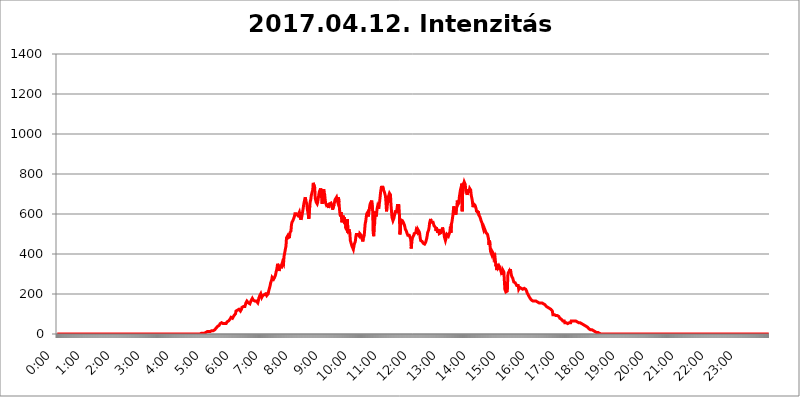
| Category | 2017.04.12. Intenzitás [W/m^2] |
|---|---|
| 0.0 | 0 |
| 0.0006944444444444445 | 0 |
| 0.001388888888888889 | 0 |
| 0.0020833333333333333 | 0 |
| 0.002777777777777778 | 0 |
| 0.003472222222222222 | 0 |
| 0.004166666666666667 | 0 |
| 0.004861111111111111 | 0 |
| 0.005555555555555556 | 0 |
| 0.0062499999999999995 | 0 |
| 0.006944444444444444 | 0 |
| 0.007638888888888889 | 0 |
| 0.008333333333333333 | 0 |
| 0.009027777777777779 | 0 |
| 0.009722222222222222 | 0 |
| 0.010416666666666666 | 0 |
| 0.011111111111111112 | 0 |
| 0.011805555555555555 | 0 |
| 0.012499999999999999 | 0 |
| 0.013194444444444444 | 0 |
| 0.013888888888888888 | 0 |
| 0.014583333333333332 | 0 |
| 0.015277777777777777 | 0 |
| 0.015972222222222224 | 0 |
| 0.016666666666666666 | 0 |
| 0.017361111111111112 | 0 |
| 0.018055555555555557 | 0 |
| 0.01875 | 0 |
| 0.019444444444444445 | 0 |
| 0.02013888888888889 | 0 |
| 0.020833333333333332 | 0 |
| 0.02152777777777778 | 0 |
| 0.022222222222222223 | 0 |
| 0.02291666666666667 | 0 |
| 0.02361111111111111 | 0 |
| 0.024305555555555556 | 0 |
| 0.024999999999999998 | 0 |
| 0.025694444444444447 | 0 |
| 0.02638888888888889 | 0 |
| 0.027083333333333334 | 0 |
| 0.027777777777777776 | 0 |
| 0.02847222222222222 | 0 |
| 0.029166666666666664 | 0 |
| 0.029861111111111113 | 0 |
| 0.030555555555555555 | 0 |
| 0.03125 | 0 |
| 0.03194444444444445 | 0 |
| 0.03263888888888889 | 0 |
| 0.03333333333333333 | 0 |
| 0.034027777777777775 | 0 |
| 0.034722222222222224 | 0 |
| 0.035416666666666666 | 0 |
| 0.036111111111111115 | 0 |
| 0.03680555555555556 | 0 |
| 0.0375 | 0 |
| 0.03819444444444444 | 0 |
| 0.03888888888888889 | 0 |
| 0.03958333333333333 | 0 |
| 0.04027777777777778 | 0 |
| 0.04097222222222222 | 0 |
| 0.041666666666666664 | 0 |
| 0.042361111111111106 | 0 |
| 0.04305555555555556 | 0 |
| 0.043750000000000004 | 0 |
| 0.044444444444444446 | 0 |
| 0.04513888888888889 | 0 |
| 0.04583333333333334 | 0 |
| 0.04652777777777778 | 0 |
| 0.04722222222222222 | 0 |
| 0.04791666666666666 | 0 |
| 0.04861111111111111 | 0 |
| 0.049305555555555554 | 0 |
| 0.049999999999999996 | 0 |
| 0.05069444444444445 | 0 |
| 0.051388888888888894 | 0 |
| 0.052083333333333336 | 0 |
| 0.05277777777777778 | 0 |
| 0.05347222222222222 | 0 |
| 0.05416666666666667 | 0 |
| 0.05486111111111111 | 0 |
| 0.05555555555555555 | 0 |
| 0.05625 | 0 |
| 0.05694444444444444 | 0 |
| 0.057638888888888885 | 0 |
| 0.05833333333333333 | 0 |
| 0.05902777777777778 | 0 |
| 0.059722222222222225 | 0 |
| 0.06041666666666667 | 0 |
| 0.061111111111111116 | 0 |
| 0.06180555555555556 | 0 |
| 0.0625 | 0 |
| 0.06319444444444444 | 0 |
| 0.06388888888888888 | 0 |
| 0.06458333333333334 | 0 |
| 0.06527777777777778 | 0 |
| 0.06597222222222222 | 0 |
| 0.06666666666666667 | 0 |
| 0.06736111111111111 | 0 |
| 0.06805555555555555 | 0 |
| 0.06874999999999999 | 0 |
| 0.06944444444444443 | 0 |
| 0.07013888888888889 | 0 |
| 0.07083333333333333 | 0 |
| 0.07152777777777779 | 0 |
| 0.07222222222222223 | 0 |
| 0.07291666666666667 | 0 |
| 0.07361111111111111 | 0 |
| 0.07430555555555556 | 0 |
| 0.075 | 0 |
| 0.07569444444444444 | 0 |
| 0.0763888888888889 | 0 |
| 0.07708333333333334 | 0 |
| 0.07777777777777778 | 0 |
| 0.07847222222222222 | 0 |
| 0.07916666666666666 | 0 |
| 0.0798611111111111 | 0 |
| 0.08055555555555556 | 0 |
| 0.08125 | 0 |
| 0.08194444444444444 | 0 |
| 0.08263888888888889 | 0 |
| 0.08333333333333333 | 0 |
| 0.08402777777777777 | 0 |
| 0.08472222222222221 | 0 |
| 0.08541666666666665 | 0 |
| 0.08611111111111112 | 0 |
| 0.08680555555555557 | 0 |
| 0.08750000000000001 | 0 |
| 0.08819444444444445 | 0 |
| 0.08888888888888889 | 0 |
| 0.08958333333333333 | 0 |
| 0.09027777777777778 | 0 |
| 0.09097222222222222 | 0 |
| 0.09166666666666667 | 0 |
| 0.09236111111111112 | 0 |
| 0.09305555555555556 | 0 |
| 0.09375 | 0 |
| 0.09444444444444444 | 0 |
| 0.09513888888888888 | 0 |
| 0.09583333333333333 | 0 |
| 0.09652777777777777 | 0 |
| 0.09722222222222222 | 0 |
| 0.09791666666666667 | 0 |
| 0.09861111111111111 | 0 |
| 0.09930555555555555 | 0 |
| 0.09999999999999999 | 0 |
| 0.10069444444444443 | 0 |
| 0.1013888888888889 | 0 |
| 0.10208333333333335 | 0 |
| 0.10277777777777779 | 0 |
| 0.10347222222222223 | 0 |
| 0.10416666666666667 | 0 |
| 0.10486111111111111 | 0 |
| 0.10555555555555556 | 0 |
| 0.10625 | 0 |
| 0.10694444444444444 | 0 |
| 0.1076388888888889 | 0 |
| 0.10833333333333334 | 0 |
| 0.10902777777777778 | 0 |
| 0.10972222222222222 | 0 |
| 0.1111111111111111 | 0 |
| 0.11180555555555556 | 0 |
| 0.11180555555555556 | 0 |
| 0.1125 | 0 |
| 0.11319444444444444 | 0 |
| 0.11388888888888889 | 0 |
| 0.11458333333333333 | 0 |
| 0.11527777777777777 | 0 |
| 0.11597222222222221 | 0 |
| 0.11666666666666665 | 0 |
| 0.1173611111111111 | 0 |
| 0.11805555555555557 | 0 |
| 0.11944444444444445 | 0 |
| 0.12013888888888889 | 0 |
| 0.12083333333333333 | 0 |
| 0.12152777777777778 | 0 |
| 0.12222222222222223 | 0 |
| 0.12291666666666667 | 0 |
| 0.12291666666666667 | 0 |
| 0.12361111111111112 | 0 |
| 0.12430555555555556 | 0 |
| 0.125 | 0 |
| 0.12569444444444444 | 0 |
| 0.12638888888888888 | 0 |
| 0.12708333333333333 | 0 |
| 0.16875 | 0 |
| 0.12847222222222224 | 0 |
| 0.12916666666666668 | 0 |
| 0.12986111111111112 | 0 |
| 0.13055555555555556 | 0 |
| 0.13125 | 0 |
| 0.13194444444444445 | 0 |
| 0.1326388888888889 | 0 |
| 0.13333333333333333 | 0 |
| 0.13402777777777777 | 0 |
| 0.13402777777777777 | 0 |
| 0.13472222222222222 | 0 |
| 0.13541666666666666 | 0 |
| 0.1361111111111111 | 0 |
| 0.13749999999999998 | 0 |
| 0.13819444444444443 | 0 |
| 0.1388888888888889 | 0 |
| 0.13958333333333334 | 0 |
| 0.14027777777777778 | 0 |
| 0.14097222222222222 | 0 |
| 0.14166666666666666 | 0 |
| 0.1423611111111111 | 0 |
| 0.14305555555555557 | 0 |
| 0.14375000000000002 | 0 |
| 0.14444444444444446 | 0 |
| 0.1451388888888889 | 0 |
| 0.1451388888888889 | 0 |
| 0.14652777777777778 | 0 |
| 0.14722222222222223 | 0 |
| 0.14791666666666667 | 0 |
| 0.1486111111111111 | 0 |
| 0.14930555555555555 | 0 |
| 0.15 | 0 |
| 0.15069444444444444 | 0 |
| 0.15138888888888888 | 0 |
| 0.15208333333333332 | 0 |
| 0.15277777777777776 | 0 |
| 0.15347222222222223 | 0 |
| 0.15416666666666667 | 0 |
| 0.15486111111111112 | 0 |
| 0.15555555555555556 | 0 |
| 0.15625 | 0 |
| 0.15694444444444444 | 0 |
| 0.15763888888888888 | 0 |
| 0.15833333333333333 | 0 |
| 0.15902777777777777 | 0 |
| 0.15972222222222224 | 0 |
| 0.16041666666666668 | 0 |
| 0.16111111111111112 | 0 |
| 0.16180555555555556 | 0 |
| 0.1625 | 0 |
| 0.16319444444444445 | 0 |
| 0.1638888888888889 | 0 |
| 0.16458333333333333 | 0 |
| 0.16527777777777777 | 0 |
| 0.16597222222222222 | 0 |
| 0.16666666666666666 | 0 |
| 0.1673611111111111 | 0 |
| 0.16805555555555554 | 0 |
| 0.16874999999999998 | 0 |
| 0.16944444444444443 | 0 |
| 0.17013888888888887 | 0 |
| 0.1708333333333333 | 0 |
| 0.17152777777777775 | 0 |
| 0.17222222222222225 | 0 |
| 0.1729166666666667 | 0 |
| 0.17361111111111113 | 0 |
| 0.17430555555555557 | 0 |
| 0.17500000000000002 | 0 |
| 0.17569444444444446 | 0 |
| 0.1763888888888889 | 0 |
| 0.17708333333333334 | 0 |
| 0.17777777777777778 | 0 |
| 0.17847222222222223 | 0 |
| 0.17916666666666667 | 0 |
| 0.1798611111111111 | 0 |
| 0.18055555555555555 | 0 |
| 0.18125 | 0 |
| 0.18194444444444444 | 0 |
| 0.1826388888888889 | 0 |
| 0.18333333333333335 | 0 |
| 0.1840277777777778 | 0 |
| 0.18472222222222223 | 0 |
| 0.18541666666666667 | 0 |
| 0.18611111111111112 | 0 |
| 0.18680555555555556 | 0 |
| 0.1875 | 0 |
| 0.18819444444444444 | 0 |
| 0.18888888888888888 | 0 |
| 0.18958333333333333 | 0 |
| 0.19027777777777777 | 0 |
| 0.1909722222222222 | 0 |
| 0.19166666666666665 | 0 |
| 0.19236111111111112 | 0 |
| 0.19305555555555554 | 0 |
| 0.19375 | 0 |
| 0.19444444444444445 | 0 |
| 0.1951388888888889 | 0 |
| 0.19583333333333333 | 0 |
| 0.19652777777777777 | 0 |
| 0.19722222222222222 | 0 |
| 0.19791666666666666 | 0 |
| 0.1986111111111111 | 0 |
| 0.19930555555555554 | 0 |
| 0.19999999999999998 | 0 |
| 0.20069444444444443 | 0 |
| 0.20138888888888887 | 3.525 |
| 0.2020833333333333 | 3.525 |
| 0.2027777777777778 | 3.525 |
| 0.2034722222222222 | 3.525 |
| 0.2041666666666667 | 3.525 |
| 0.20486111111111113 | 3.525 |
| 0.20555555555555557 | 7.887 |
| 0.20625000000000002 | 3.525 |
| 0.20694444444444446 | 7.887 |
| 0.2076388888888889 | 7.887 |
| 0.20833333333333334 | 7.887 |
| 0.20902777777777778 | 12.257 |
| 0.20972222222222223 | 12.257 |
| 0.21041666666666667 | 12.257 |
| 0.2111111111111111 | 12.257 |
| 0.21180555555555555 | 12.257 |
| 0.2125 | 12.257 |
| 0.21319444444444444 | 12.257 |
| 0.2138888888888889 | 12.257 |
| 0.21458333333333335 | 12.257 |
| 0.2152777777777778 | 12.257 |
| 0.21597222222222223 | 16.636 |
| 0.21666666666666667 | 16.636 |
| 0.21736111111111112 | 16.636 |
| 0.21805555555555556 | 16.636 |
| 0.21875 | 16.636 |
| 0.21944444444444444 | 21.024 |
| 0.22013888888888888 | 21.024 |
| 0.22083333333333333 | 21.024 |
| 0.22152777777777777 | 25.419 |
| 0.2222222222222222 | 25.419 |
| 0.22291666666666665 | 29.823 |
| 0.2236111111111111 | 29.823 |
| 0.22430555555555556 | 34.234 |
| 0.225 | 38.653 |
| 0.22569444444444445 | 38.653 |
| 0.2263888888888889 | 38.653 |
| 0.22708333333333333 | 43.079 |
| 0.22777777777777777 | 47.511 |
| 0.22847222222222222 | 51.951 |
| 0.22916666666666666 | 51.951 |
| 0.2298611111111111 | 51.951 |
| 0.23055555555555554 | 56.398 |
| 0.23124999999999998 | 56.398 |
| 0.23194444444444443 | 51.951 |
| 0.23263888888888887 | 51.951 |
| 0.2333333333333333 | 51.951 |
| 0.2340277777777778 | 51.951 |
| 0.2347222222222222 | 51.951 |
| 0.2354166666666667 | 51.951 |
| 0.23611111111111113 | 51.951 |
| 0.23680555555555557 | 51.951 |
| 0.23750000000000002 | 56.398 |
| 0.23819444444444446 | 60.85 |
| 0.2388888888888889 | 65.31 |
| 0.23958333333333334 | 65.31 |
| 0.24027777777777778 | 65.31 |
| 0.24097222222222223 | 65.31 |
| 0.24166666666666667 | 69.775 |
| 0.2423611111111111 | 74.246 |
| 0.24305555555555555 | 78.722 |
| 0.24375 | 83.205 |
| 0.24444444444444446 | 83.205 |
| 0.24513888888888888 | 78.722 |
| 0.24583333333333335 | 78.722 |
| 0.2465277777777778 | 78.722 |
| 0.24722222222222223 | 83.205 |
| 0.24791666666666667 | 92.184 |
| 0.24861111111111112 | 92.184 |
| 0.24930555555555556 | 96.682 |
| 0.25 | 101.184 |
| 0.25069444444444444 | 114.716 |
| 0.2513888888888889 | 114.716 |
| 0.2520833333333333 | 119.235 |
| 0.25277777777777777 | 119.235 |
| 0.2534722222222222 | 123.758 |
| 0.25416666666666665 | 123.758 |
| 0.2548611111111111 | 123.758 |
| 0.2555555555555556 | 119.235 |
| 0.25625000000000003 | 119.235 |
| 0.2569444444444445 | 114.716 |
| 0.2576388888888889 | 119.235 |
| 0.25833333333333336 | 123.758 |
| 0.2590277777777778 | 132.814 |
| 0.25972222222222224 | 137.347 |
| 0.2604166666666667 | 137.347 |
| 0.2611111111111111 | 137.347 |
| 0.26180555555555557 | 132.814 |
| 0.2625 | 137.347 |
| 0.26319444444444445 | 137.347 |
| 0.2638888888888889 | 146.423 |
| 0.26458333333333334 | 155.509 |
| 0.2652777777777778 | 160.056 |
| 0.2659722222222222 | 164.605 |
| 0.26666666666666666 | 169.156 |
| 0.2673611111111111 | 169.156 |
| 0.26805555555555555 | 155.509 |
| 0.26875 | 155.509 |
| 0.26944444444444443 | 150.964 |
| 0.2701388888888889 | 150.964 |
| 0.2708333333333333 | 155.509 |
| 0.27152777777777776 | 164.605 |
| 0.2722222222222222 | 164.605 |
| 0.27291666666666664 | 169.156 |
| 0.2736111111111111 | 178.264 |
| 0.2743055555555555 | 173.709 |
| 0.27499999999999997 | 169.156 |
| 0.27569444444444446 | 169.156 |
| 0.27638888888888885 | 169.156 |
| 0.27708333333333335 | 164.605 |
| 0.2777777777777778 | 164.605 |
| 0.27847222222222223 | 164.605 |
| 0.2791666666666667 | 164.605 |
| 0.2798611111111111 | 160.056 |
| 0.28055555555555556 | 160.056 |
| 0.28125 | 155.509 |
| 0.28194444444444444 | 164.605 |
| 0.2826388888888889 | 178.264 |
| 0.2833333333333333 | 182.82 |
| 0.28402777777777777 | 191.937 |
| 0.2847222222222222 | 196.497 |
| 0.28541666666666665 | 201.058 |
| 0.28611111111111115 | 191.937 |
| 0.28680555555555554 | 182.82 |
| 0.28750000000000003 | 182.82 |
| 0.2881944444444445 | 191.937 |
| 0.2888888888888889 | 187.378 |
| 0.28958333333333336 | 187.378 |
| 0.2902777777777778 | 196.497 |
| 0.29097222222222224 | 201.058 |
| 0.2916666666666667 | 201.058 |
| 0.2923611111111111 | 201.058 |
| 0.29305555555555557 | 196.497 |
| 0.29375 | 191.937 |
| 0.29444444444444445 | 191.937 |
| 0.2951388888888889 | 191.937 |
| 0.29583333333333334 | 201.058 |
| 0.2965277777777778 | 214.746 |
| 0.2972222222222222 | 223.873 |
| 0.29791666666666666 | 228.436 |
| 0.2986111111111111 | 242.127 |
| 0.29930555555555555 | 255.813 |
| 0.3 | 260.373 |
| 0.30069444444444443 | 269.49 |
| 0.3013888888888889 | 283.156 |
| 0.3020833333333333 | 283.156 |
| 0.30277777777777776 | 283.156 |
| 0.3034722222222222 | 274.047 |
| 0.30416666666666664 | 274.047 |
| 0.3048611111111111 | 283.156 |
| 0.3055555555555555 | 287.709 |
| 0.30624999999999997 | 296.808 |
| 0.3069444444444444 | 310.44 |
| 0.3076388888888889 | 319.517 |
| 0.30833333333333335 | 333.113 |
| 0.3090277777777778 | 351.198 |
| 0.30972222222222223 | 351.198 |
| 0.3104166666666667 | 333.113 |
| 0.3111111111111111 | 314.98 |
| 0.31180555555555556 | 328.584 |
| 0.3125 | 324.052 |
| 0.31319444444444444 | 337.639 |
| 0.3138888888888889 | 346.682 |
| 0.3145833333333333 | 328.584 |
| 0.31527777777777777 | 351.198 |
| 0.3159722222222222 | 360.221 |
| 0.31666666666666665 | 364.728 |
| 0.31736111111111115 | 351.198 |
| 0.31805555555555554 | 387.202 |
| 0.31875000000000003 | 400.638 |
| 0.3194444444444445 | 405.108 |
| 0.3201388888888889 | 405.108 |
| 0.32083333333333336 | 440.702 |
| 0.3215277777777778 | 480.356 |
| 0.32222222222222224 | 484.735 |
| 0.3229166666666667 | 489.108 |
| 0.3236111111111111 | 480.356 |
| 0.32430555555555557 | 484.735 |
| 0.325 | 475.972 |
| 0.32569444444444445 | 484.735 |
| 0.3263888888888889 | 506.542 |
| 0.32708333333333334 | 506.542 |
| 0.3277777777777778 | 515.223 |
| 0.3284722222222222 | 545.416 |
| 0.32916666666666666 | 558.261 |
| 0.3298611111111111 | 558.261 |
| 0.33055555555555555 | 566.793 |
| 0.33125 | 566.793 |
| 0.33194444444444443 | 571.049 |
| 0.3326388888888889 | 588.009 |
| 0.3333333333333333 | 600.661 |
| 0.3340277777777778 | 604.864 |
| 0.3347222222222222 | 604.864 |
| 0.3354166666666667 | 600.661 |
| 0.3361111111111111 | 596.45 |
| 0.3368055555555556 | 596.45 |
| 0.33749999999999997 | 592.233 |
| 0.33819444444444446 | 588.009 |
| 0.33888888888888885 | 592.233 |
| 0.33958333333333335 | 609.062 |
| 0.34027777777777773 | 596.45 |
| 0.34097222222222223 | 583.779 |
| 0.3416666666666666 | 571.049 |
| 0.3423611111111111 | 575.299 |
| 0.3430555555555555 | 588.009 |
| 0.34375 | 588.009 |
| 0.3444444444444445 | 617.436 |
| 0.3451388888888889 | 634.105 |
| 0.3458333333333334 | 650.667 |
| 0.34652777777777777 | 654.791 |
| 0.34722222222222227 | 675.311 |
| 0.34791666666666665 | 683.473 |
| 0.34861111111111115 | 667.123 |
| 0.34930555555555554 | 658.909 |
| 0.35000000000000003 | 650.667 |
| 0.3506944444444444 | 625.784 |
| 0.3513888888888889 | 625.784 |
| 0.3520833333333333 | 596.45 |
| 0.3527777777777778 | 575.299 |
| 0.3534722222222222 | 575.299 |
| 0.3541666666666667 | 642.4 |
| 0.3548611111111111 | 663.019 |
| 0.35555555555555557 | 671.22 |
| 0.35625 | 691.608 |
| 0.35694444444444445 | 691.608 |
| 0.3576388888888889 | 711.832 |
| 0.35833333333333334 | 719.877 |
| 0.3590277777777778 | 755.766 |
| 0.3597222222222222 | 755.766 |
| 0.36041666666666666 | 751.803 |
| 0.3611111111111111 | 731.896 |
| 0.36180555555555555 | 679.395 |
| 0.3625 | 675.311 |
| 0.36319444444444443 | 658.909 |
| 0.3638888888888889 | 658.909 |
| 0.3645833333333333 | 650.667 |
| 0.3652777777777778 | 658.909 |
| 0.3659722222222222 | 675.311 |
| 0.3666666666666667 | 691.608 |
| 0.3673611111111111 | 707.8 |
| 0.3680555555555556 | 715.858 |
| 0.36874999999999997 | 711.832 |
| 0.36944444444444446 | 727.896 |
| 0.37013888888888885 | 703.762 |
| 0.37083333333333335 | 679.395 |
| 0.37152777777777773 | 650.667 |
| 0.37222222222222223 | 683.473 |
| 0.3729166666666666 | 707.8 |
| 0.3736111111111111 | 723.889 |
| 0.3743055555555555 | 707.8 |
| 0.375 | 699.717 |
| 0.3756944444444445 | 675.311 |
| 0.3763888888888889 | 654.791 |
| 0.3770833333333334 | 650.667 |
| 0.37777777777777777 | 642.4 |
| 0.37847222222222227 | 642.4 |
| 0.37916666666666665 | 646.537 |
| 0.37986111111111115 | 646.537 |
| 0.38055555555555554 | 629.948 |
| 0.38125000000000003 | 642.4 |
| 0.3819444444444444 | 650.667 |
| 0.3826388888888889 | 646.537 |
| 0.3833333333333333 | 646.537 |
| 0.3840277777777778 | 654.791 |
| 0.3847222222222222 | 650.667 |
| 0.3854166666666667 | 642.4 |
| 0.3861111111111111 | 621.613 |
| 0.38680555555555557 | 617.436 |
| 0.3875 | 625.784 |
| 0.38819444444444445 | 646.537 |
| 0.3888888888888889 | 658.909 |
| 0.38958333333333334 | 671.22 |
| 0.3902777777777778 | 675.311 |
| 0.3909722222222222 | 671.22 |
| 0.39166666666666666 | 683.473 |
| 0.3923611111111111 | 671.22 |
| 0.39305555555555555 | 663.019 |
| 0.39375 | 667.123 |
| 0.39444444444444443 | 683.473 |
| 0.3951388888888889 | 658.909 |
| 0.3958333333333333 | 625.784 |
| 0.3965277777777778 | 600.661 |
| 0.3972222222222222 | 588.009 |
| 0.3979166666666667 | 609.062 |
| 0.3986111111111111 | 583.779 |
| 0.3993055555555556 | 558.261 |
| 0.39999999999999997 | 575.299 |
| 0.40069444444444446 | 592.233 |
| 0.40138888888888885 | 592.233 |
| 0.40208333333333335 | 575.299 |
| 0.40277777777777773 | 583.779 |
| 0.40347222222222223 | 549.704 |
| 0.4041666666666666 | 558.261 |
| 0.4048611111111111 | 528.2 |
| 0.4055555555555555 | 532.513 |
| 0.40625 | 519.555 |
| 0.4069444444444445 | 575.299 |
| 0.4076388888888889 | 506.542 |
| 0.4083333333333334 | 510.885 |
| 0.40902777777777777 | 523.88 |
| 0.40972222222222227 | 519.555 |
| 0.41041666666666665 | 502.192 |
| 0.41111111111111115 | 467.187 |
| 0.41180555555555554 | 471.582 |
| 0.41250000000000003 | 449.551 |
| 0.4131944444444444 | 440.702 |
| 0.4138888888888889 | 440.702 |
| 0.4145833333333333 | 436.27 |
| 0.4152777777777778 | 422.943 |
| 0.4159722222222222 | 422.943 |
| 0.4166666666666667 | 449.551 |
| 0.4173611111111111 | 453.968 |
| 0.41805555555555557 | 462.786 |
| 0.41875 | 484.735 |
| 0.41944444444444445 | 497.836 |
| 0.4201388888888889 | 502.192 |
| 0.42083333333333334 | 493.475 |
| 0.4215277777777778 | 497.836 |
| 0.4222222222222222 | 502.192 |
| 0.42291666666666666 | 493.475 |
| 0.4236111111111111 | 489.108 |
| 0.42430555555555555 | 502.192 |
| 0.425 | 506.542 |
| 0.42569444444444443 | 497.836 |
| 0.4263888888888889 | 493.475 |
| 0.4270833333333333 | 484.735 |
| 0.4277777777777778 | 480.356 |
| 0.4284722222222222 | 462.786 |
| 0.4291666666666667 | 475.972 |
| 0.4298611111111111 | 475.972 |
| 0.4305555555555556 | 493.475 |
| 0.43124999999999997 | 523.88 |
| 0.43194444444444446 | 553.986 |
| 0.43263888888888885 | 562.53 |
| 0.43333333333333335 | 583.779 |
| 0.43402777777777773 | 600.661 |
| 0.43472222222222223 | 604.864 |
| 0.4354166666666666 | 609.062 |
| 0.4361111111111111 | 588.009 |
| 0.4368055555555555 | 600.661 |
| 0.4375 | 617.436 |
| 0.4381944444444445 | 638.256 |
| 0.4388888888888889 | 650.667 |
| 0.4395833333333334 | 650.667 |
| 0.44027777777777777 | 654.791 |
| 0.44097222222222227 | 667.123 |
| 0.44166666666666665 | 663.019 |
| 0.44236111111111115 | 617.436 |
| 0.44305555555555554 | 510.885 |
| 0.44375000000000003 | 489.108 |
| 0.4444444444444444 | 532.513 |
| 0.4451388888888889 | 549.704 |
| 0.4458333333333333 | 596.45 |
| 0.4465277777777778 | 613.252 |
| 0.4472222222222222 | 588.009 |
| 0.4479166666666667 | 604.864 |
| 0.4486111111111111 | 625.784 |
| 0.44930555555555557 | 638.256 |
| 0.45 | 638.256 |
| 0.45069444444444445 | 625.784 |
| 0.4513888888888889 | 646.537 |
| 0.45208333333333334 | 658.909 |
| 0.4527777777777778 | 683.473 |
| 0.4534722222222222 | 707.8 |
| 0.45416666666666666 | 723.889 |
| 0.4548611111111111 | 739.877 |
| 0.45555555555555555 | 727.896 |
| 0.45625 | 739.877 |
| 0.45694444444444443 | 739.877 |
| 0.4576388888888889 | 719.877 |
| 0.4583333333333333 | 723.889 |
| 0.4590277777777778 | 707.8 |
| 0.4597222222222222 | 703.762 |
| 0.4604166666666667 | 687.544 |
| 0.4611111111111111 | 654.791 |
| 0.4618055555555556 | 613.252 |
| 0.46249999999999997 | 634.105 |
| 0.46319444444444446 | 650.667 |
| 0.46388888888888885 | 675.311 |
| 0.46458333333333335 | 687.544 |
| 0.46527777777777773 | 695.666 |
| 0.46597222222222223 | 703.762 |
| 0.4666666666666666 | 703.762 |
| 0.4673611111111111 | 695.666 |
| 0.4680555555555555 | 646.537 |
| 0.46875 | 617.436 |
| 0.4694444444444445 | 583.779 |
| 0.4701388888888889 | 575.299 |
| 0.4708333333333334 | 566.793 |
| 0.47152777777777777 | 562.53 |
| 0.47222222222222227 | 579.542 |
| 0.47291666666666665 | 592.233 |
| 0.47361111111111115 | 592.233 |
| 0.47430555555555554 | 617.436 |
| 0.47500000000000003 | 604.864 |
| 0.4756944444444444 | 613.252 |
| 0.4763888888888889 | 621.613 |
| 0.4770833333333333 | 642.4 |
| 0.4777777777777778 | 638.256 |
| 0.4784722222222222 | 646.537 |
| 0.4791666666666667 | 642.4 |
| 0.4798611111111111 | 600.661 |
| 0.48055555555555557 | 497.836 |
| 0.48125 | 515.223 |
| 0.48194444444444445 | 571.049 |
| 0.4826388888888889 | 575.299 |
| 0.48333333333333334 | 566.793 |
| 0.4840277777777778 | 566.793 |
| 0.4847222222222222 | 562.53 |
| 0.48541666666666666 | 558.261 |
| 0.4861111111111111 | 558.261 |
| 0.48680555555555555 | 545.416 |
| 0.4875 | 536.82 |
| 0.48819444444444443 | 523.88 |
| 0.4888888888888889 | 519.555 |
| 0.4895833333333333 | 515.223 |
| 0.4902777777777778 | 506.542 |
| 0.4909722222222222 | 502.192 |
| 0.4916666666666667 | 493.475 |
| 0.4923611111111111 | 489.108 |
| 0.4930555555555556 | 493.475 |
| 0.49374999999999997 | 493.475 |
| 0.49444444444444446 | 489.108 |
| 0.49513888888888885 | 480.356 |
| 0.49583333333333335 | 471.582 |
| 0.49652777777777773 | 427.39 |
| 0.49722222222222223 | 462.786 |
| 0.4979166666666666 | 475.972 |
| 0.4986111111111111 | 484.735 |
| 0.4993055555555555 | 484.735 |
| 0.5 | 493.475 |
| 0.5006944444444444 | 502.192 |
| 0.5013888888888889 | 506.542 |
| 0.5020833333333333 | 502.192 |
| 0.5027777777777778 | 506.542 |
| 0.5034722222222222 | 519.555 |
| 0.5041666666666667 | 515.223 |
| 0.5048611111111111 | 510.885 |
| 0.5055555555555555 | 523.88 |
| 0.50625 | 523.88 |
| 0.5069444444444444 | 523.88 |
| 0.5076388888888889 | 510.885 |
| 0.5083333333333333 | 502.192 |
| 0.5090277777777777 | 480.356 |
| 0.5097222222222222 | 467.187 |
| 0.5104166666666666 | 462.786 |
| 0.5111111111111112 | 471.582 |
| 0.5118055555555555 | 462.786 |
| 0.5125000000000001 | 462.786 |
| 0.5131944444444444 | 453.968 |
| 0.513888888888889 | 453.968 |
| 0.5145833333333333 | 453.968 |
| 0.5152777777777778 | 449.551 |
| 0.5159722222222222 | 453.968 |
| 0.5166666666666667 | 458.38 |
| 0.517361111111111 | 462.786 |
| 0.5180555555555556 | 475.972 |
| 0.5187499999999999 | 489.108 |
| 0.5194444444444445 | 506.542 |
| 0.5201388888888888 | 510.885 |
| 0.5208333333333334 | 519.555 |
| 0.5215277777777778 | 532.513 |
| 0.5222222222222223 | 553.986 |
| 0.5229166666666667 | 558.261 |
| 0.5236111111111111 | 575.299 |
| 0.5243055555555556 | 566.793 |
| 0.525 | 558.261 |
| 0.5256944444444445 | 558.261 |
| 0.5263888888888889 | 558.261 |
| 0.5270833333333333 | 558.261 |
| 0.5277777777777778 | 553.986 |
| 0.5284722222222222 | 541.121 |
| 0.5291666666666667 | 541.121 |
| 0.5298611111111111 | 541.121 |
| 0.5305555555555556 | 532.513 |
| 0.53125 | 515.223 |
| 0.5319444444444444 | 532.513 |
| 0.5326388888888889 | 519.555 |
| 0.5333333333333333 | 506.542 |
| 0.5340277777777778 | 523.88 |
| 0.5347222222222222 | 515.223 |
| 0.5354166666666667 | 523.88 |
| 0.5361111111111111 | 502.192 |
| 0.5368055555555555 | 502.192 |
| 0.5375 | 502.192 |
| 0.5381944444444444 | 506.542 |
| 0.5388888888888889 | 506.542 |
| 0.5395833333333333 | 515.223 |
| 0.5402777777777777 | 532.513 |
| 0.5409722222222222 | 523.88 |
| 0.5416666666666666 | 528.2 |
| 0.5423611111111112 | 502.192 |
| 0.5430555555555555 | 484.735 |
| 0.5437500000000001 | 475.972 |
| 0.5444444444444444 | 467.187 |
| 0.545138888888889 | 475.972 |
| 0.5458333333333333 | 489.108 |
| 0.5465277777777778 | 497.836 |
| 0.5472222222222222 | 502.192 |
| 0.5479166666666667 | 502.192 |
| 0.548611111111111 | 489.108 |
| 0.5493055555555556 | 484.735 |
| 0.5499999999999999 | 489.108 |
| 0.5506944444444445 | 510.885 |
| 0.5513888888888888 | 536.82 |
| 0.5520833333333334 | 506.542 |
| 0.5527777777777778 | 549.704 |
| 0.5534722222222223 | 558.261 |
| 0.5541666666666667 | 575.299 |
| 0.5548611111111111 | 592.233 |
| 0.5555555555555556 | 617.436 |
| 0.55625 | 638.256 |
| 0.5569444444444445 | 621.613 |
| 0.5576388888888889 | 621.613 |
| 0.5583333333333333 | 617.436 |
| 0.5590277777777778 | 596.45 |
| 0.5597222222222222 | 625.784 |
| 0.5604166666666667 | 634.105 |
| 0.5611111111111111 | 667.123 |
| 0.5618055555555556 | 646.537 |
| 0.5625 | 646.537 |
| 0.5631944444444444 | 654.791 |
| 0.5638888888888889 | 683.473 |
| 0.5645833333333333 | 687.544 |
| 0.5652777777777778 | 715.858 |
| 0.5659722222222222 | 727.896 |
| 0.5666666666666667 | 735.89 |
| 0.5673611111111111 | 751.803 |
| 0.5680555555555555 | 613.252 |
| 0.56875 | 735.89 |
| 0.5694444444444444 | 755.766 |
| 0.5701388888888889 | 747.834 |
| 0.5708333333333333 | 759.723 |
| 0.5715277777777777 | 755.766 |
| 0.5722222222222222 | 747.834 |
| 0.5729166666666666 | 719.877 |
| 0.5736111111111112 | 719.877 |
| 0.5743055555555555 | 715.858 |
| 0.5750000000000001 | 695.666 |
| 0.5756944444444444 | 707.8 |
| 0.576388888888889 | 723.889 |
| 0.5770833333333333 | 707.8 |
| 0.5777777777777778 | 715.858 |
| 0.5784722222222222 | 727.896 |
| 0.5791666666666667 | 727.896 |
| 0.579861111111111 | 719.877 |
| 0.5805555555555556 | 695.666 |
| 0.5812499999999999 | 691.608 |
| 0.5819444444444445 | 671.22 |
| 0.5826388888888888 | 650.667 |
| 0.5833333333333334 | 634.105 |
| 0.5840277777777778 | 650.667 |
| 0.5847222222222223 | 646.537 |
| 0.5854166666666667 | 646.537 |
| 0.5861111111111111 | 642.4 |
| 0.5868055555555556 | 638.256 |
| 0.5875 | 625.784 |
| 0.5881944444444445 | 609.062 |
| 0.5888888888888889 | 617.436 |
| 0.5895833333333333 | 604.864 |
| 0.5902777777777778 | 613.252 |
| 0.5909722222222222 | 613.252 |
| 0.5916666666666667 | 592.233 |
| 0.5923611111111111 | 588.009 |
| 0.5930555555555556 | 583.779 |
| 0.59375 | 579.542 |
| 0.5944444444444444 | 566.793 |
| 0.5951388888888889 | 562.53 |
| 0.5958333333333333 | 553.986 |
| 0.5965277777777778 | 558.261 |
| 0.5972222222222222 | 532.513 |
| 0.5979166666666667 | 523.88 |
| 0.5986111111111111 | 532.513 |
| 0.5993055555555555 | 532.513 |
| 0.6 | 519.555 |
| 0.6006944444444444 | 523.88 |
| 0.6013888888888889 | 506.542 |
| 0.6020833333333333 | 506.542 |
| 0.6027777777777777 | 502.192 |
| 0.6034722222222222 | 497.836 |
| 0.6041666666666666 | 493.475 |
| 0.6048611111111112 | 475.972 |
| 0.6055555555555555 | 445.129 |
| 0.6062500000000001 | 467.187 |
| 0.6069444444444444 | 445.129 |
| 0.607638888888889 | 414.035 |
| 0.6083333333333333 | 414.035 |
| 0.6090277777777778 | 400.638 |
| 0.6097222222222222 | 414.035 |
| 0.6104166666666667 | 414.035 |
| 0.611111111111111 | 414.035 |
| 0.6118055555555556 | 400.638 |
| 0.6124999999999999 | 378.224 |
| 0.6131944444444445 | 378.224 |
| 0.6138888888888888 | 387.202 |
| 0.6145833333333334 | 382.715 |
| 0.6152777777777778 | 337.639 |
| 0.6159722222222223 | 351.198 |
| 0.6166666666666667 | 319.517 |
| 0.6173611111111111 | 346.682 |
| 0.6180555555555556 | 333.113 |
| 0.61875 | 328.584 |
| 0.6194444444444445 | 342.162 |
| 0.6201388888888889 | 346.682 |
| 0.6208333333333333 | 333.113 |
| 0.6215277777777778 | 324.052 |
| 0.6222222222222222 | 314.98 |
| 0.6229166666666667 | 324.052 |
| 0.6236111111111111 | 324.052 |
| 0.6243055555555556 | 296.808 |
| 0.625 | 319.517 |
| 0.6256944444444444 | 319.517 |
| 0.6263888888888889 | 310.44 |
| 0.6270833333333333 | 305.898 |
| 0.6277777777777778 | 223.873 |
| 0.6284722222222222 | 228.436 |
| 0.6291666666666667 | 210.182 |
| 0.6298611111111111 | 214.746 |
| 0.6305555555555555 | 205.62 |
| 0.63125 | 214.746 |
| 0.6319444444444444 | 292.259 |
| 0.6326388888888889 | 305.898 |
| 0.6333333333333333 | 310.44 |
| 0.6340277777777777 | 314.98 |
| 0.6347222222222222 | 305.898 |
| 0.6354166666666666 | 324.052 |
| 0.6361111111111112 | 310.44 |
| 0.6368055555555555 | 296.808 |
| 0.6375000000000001 | 287.709 |
| 0.6381944444444444 | 283.156 |
| 0.638888888888889 | 278.603 |
| 0.6395833333333333 | 269.49 |
| 0.6402777777777778 | 260.373 |
| 0.6409722222222222 | 260.373 |
| 0.6416666666666667 | 260.373 |
| 0.642361111111111 | 255.813 |
| 0.6430555555555556 | 255.813 |
| 0.6437499999999999 | 251.251 |
| 0.6444444444444445 | 242.127 |
| 0.6451388888888888 | 242.127 |
| 0.6458333333333334 | 242.127 |
| 0.6465277777777778 | 242.127 |
| 0.6472222222222223 | 223.873 |
| 0.6479166666666667 | 228.436 |
| 0.6486111111111111 | 233 |
| 0.6493055555555556 | 233 |
| 0.65 | 233 |
| 0.6506944444444445 | 228.436 |
| 0.6513888888888889 | 223.873 |
| 0.6520833333333333 | 223.873 |
| 0.6527777777777778 | 223.873 |
| 0.6534722222222222 | 228.436 |
| 0.6541666666666667 | 228.436 |
| 0.6548611111111111 | 228.436 |
| 0.6555555555555556 | 223.873 |
| 0.65625 | 223.873 |
| 0.6569444444444444 | 223.873 |
| 0.6576388888888889 | 219.309 |
| 0.6583333333333333 | 214.746 |
| 0.6590277777777778 | 205.62 |
| 0.6597222222222222 | 201.058 |
| 0.6604166666666667 | 196.497 |
| 0.6611111111111111 | 191.937 |
| 0.6618055555555555 | 187.378 |
| 0.6625 | 182.82 |
| 0.6631944444444444 | 178.264 |
| 0.6638888888888889 | 173.709 |
| 0.6645833333333333 | 173.709 |
| 0.6652777777777777 | 169.156 |
| 0.6659722222222222 | 169.156 |
| 0.6666666666666666 | 164.605 |
| 0.6673611111111111 | 164.605 |
| 0.6680555555555556 | 164.605 |
| 0.6687500000000001 | 164.605 |
| 0.6694444444444444 | 164.605 |
| 0.6701388888888888 | 169.156 |
| 0.6708333333333334 | 169.156 |
| 0.6715277777777778 | 164.605 |
| 0.6722222222222222 | 164.605 |
| 0.6729166666666666 | 160.056 |
| 0.6736111111111112 | 160.056 |
| 0.6743055555555556 | 155.509 |
| 0.6749999999999999 | 155.509 |
| 0.6756944444444444 | 155.509 |
| 0.6763888888888889 | 155.509 |
| 0.6770833333333334 | 155.509 |
| 0.6777777777777777 | 155.509 |
| 0.6784722222222223 | 155.509 |
| 0.6791666666666667 | 155.509 |
| 0.6798611111111111 | 155.509 |
| 0.6805555555555555 | 155.509 |
| 0.68125 | 150.964 |
| 0.6819444444444445 | 150.964 |
| 0.6826388888888889 | 146.423 |
| 0.6833333333333332 | 146.423 |
| 0.6840277777777778 | 146.423 |
| 0.6847222222222222 | 141.884 |
| 0.6854166666666667 | 141.884 |
| 0.686111111111111 | 137.347 |
| 0.6868055555555556 | 137.347 |
| 0.6875 | 132.814 |
| 0.6881944444444444 | 132.814 |
| 0.688888888888889 | 132.814 |
| 0.6895833333333333 | 128.284 |
| 0.6902777777777778 | 128.284 |
| 0.6909722222222222 | 128.284 |
| 0.6916666666666668 | 123.758 |
| 0.6923611111111111 | 123.758 |
| 0.6930555555555555 | 119.235 |
| 0.69375 | 119.235 |
| 0.6944444444444445 | 114.716 |
| 0.6951388888888889 | 96.682 |
| 0.6958333333333333 | 101.184 |
| 0.6965277777777777 | 96.682 |
| 0.6972222222222223 | 96.682 |
| 0.6979166666666666 | 101.184 |
| 0.6986111111111111 | 96.682 |
| 0.6993055555555556 | 92.184 |
| 0.7000000000000001 | 87.692 |
| 0.7006944444444444 | 92.184 |
| 0.7013888888888888 | 92.184 |
| 0.7020833333333334 | 92.184 |
| 0.7027777777777778 | 92.184 |
| 0.7034722222222222 | 87.692 |
| 0.7041666666666666 | 83.205 |
| 0.7048611111111112 | 78.722 |
| 0.7055555555555556 | 74.246 |
| 0.7062499999999999 | 74.246 |
| 0.7069444444444444 | 74.246 |
| 0.7076388888888889 | 69.775 |
| 0.7083333333333334 | 69.775 |
| 0.7090277777777777 | 65.31 |
| 0.7097222222222223 | 65.31 |
| 0.7104166666666667 | 65.31 |
| 0.7111111111111111 | 65.31 |
| 0.7118055555555555 | 56.398 |
| 0.7125 | 56.398 |
| 0.7131944444444445 | 60.85 |
| 0.7138888888888889 | 56.398 |
| 0.7145833333333332 | 56.398 |
| 0.7152777777777778 | 56.398 |
| 0.7159722222222222 | 51.951 |
| 0.7166666666666667 | 56.398 |
| 0.717361111111111 | 51.951 |
| 0.7180555555555556 | 56.398 |
| 0.71875 | 60.85 |
| 0.7194444444444444 | 60.85 |
| 0.720138888888889 | 56.398 |
| 0.7208333333333333 | 65.31 |
| 0.7215277777777778 | 65.31 |
| 0.7222222222222222 | 60.85 |
| 0.7229166666666668 | 65.31 |
| 0.7236111111111111 | 65.31 |
| 0.7243055555555555 | 65.31 |
| 0.725 | 65.31 |
| 0.7256944444444445 | 69.775 |
| 0.7263888888888889 | 69.775 |
| 0.7270833333333333 | 65.31 |
| 0.7277777777777777 | 65.31 |
| 0.7284722222222223 | 60.85 |
| 0.7291666666666666 | 60.85 |
| 0.7298611111111111 | 60.85 |
| 0.7305555555555556 | 60.85 |
| 0.7312500000000001 | 56.398 |
| 0.7319444444444444 | 56.398 |
| 0.7326388888888888 | 56.398 |
| 0.7333333333333334 | 56.398 |
| 0.7340277777777778 | 56.398 |
| 0.7347222222222222 | 51.951 |
| 0.7354166666666666 | 51.951 |
| 0.7361111111111112 | 51.951 |
| 0.7368055555555556 | 47.511 |
| 0.7374999999999999 | 47.511 |
| 0.7381944444444444 | 47.511 |
| 0.7388888888888889 | 47.511 |
| 0.7395833333333334 | 43.079 |
| 0.7402777777777777 | 43.079 |
| 0.7409722222222223 | 43.079 |
| 0.7416666666666667 | 38.653 |
| 0.7423611111111111 | 38.653 |
| 0.7430555555555555 | 34.234 |
| 0.74375 | 34.234 |
| 0.7444444444444445 | 29.823 |
| 0.7451388888888889 | 29.823 |
| 0.7458333333333332 | 25.419 |
| 0.7465277777777778 | 25.419 |
| 0.7472222222222222 | 21.024 |
| 0.7479166666666667 | 21.024 |
| 0.748611111111111 | 21.024 |
| 0.7493055555555556 | 21.024 |
| 0.75 | 21.024 |
| 0.7506944444444444 | 16.636 |
| 0.751388888888889 | 16.636 |
| 0.7520833333333333 | 16.636 |
| 0.7527777777777778 | 12.257 |
| 0.7534722222222222 | 12.257 |
| 0.7541666666666668 | 12.257 |
| 0.7548611111111111 | 12.257 |
| 0.7555555555555555 | 12.257 |
| 0.75625 | 7.887 |
| 0.7569444444444445 | 7.887 |
| 0.7576388888888889 | 7.887 |
| 0.7583333333333333 | 7.887 |
| 0.7590277777777777 | 7.887 |
| 0.7597222222222223 | 3.525 |
| 0.7604166666666666 | 3.525 |
| 0.7611111111111111 | 3.525 |
| 0.7618055555555556 | 0 |
| 0.7625000000000001 | 0 |
| 0.7631944444444444 | 0 |
| 0.7638888888888888 | 0 |
| 0.7645833333333334 | 0 |
| 0.7652777777777778 | 0 |
| 0.7659722222222222 | 0 |
| 0.7666666666666666 | 0 |
| 0.7673611111111112 | 0 |
| 0.7680555555555556 | 0 |
| 0.7687499999999999 | 0 |
| 0.7694444444444444 | 0 |
| 0.7701388888888889 | 0 |
| 0.7708333333333334 | 0 |
| 0.7715277777777777 | 0 |
| 0.7722222222222223 | 0 |
| 0.7729166666666667 | 0 |
| 0.7736111111111111 | 0 |
| 0.7743055555555555 | 0 |
| 0.775 | 0 |
| 0.7756944444444445 | 0 |
| 0.7763888888888889 | 0 |
| 0.7770833333333332 | 0 |
| 0.7777777777777778 | 0 |
| 0.7784722222222222 | 0 |
| 0.7791666666666667 | 0 |
| 0.779861111111111 | 0 |
| 0.7805555555555556 | 0 |
| 0.78125 | 0 |
| 0.7819444444444444 | 0 |
| 0.782638888888889 | 0 |
| 0.7833333333333333 | 0 |
| 0.7840277777777778 | 0 |
| 0.7847222222222222 | 0 |
| 0.7854166666666668 | 0 |
| 0.7861111111111111 | 0 |
| 0.7868055555555555 | 0 |
| 0.7875 | 0 |
| 0.7881944444444445 | 0 |
| 0.7888888888888889 | 0 |
| 0.7895833333333333 | 0 |
| 0.7902777777777777 | 0 |
| 0.7909722222222223 | 0 |
| 0.7916666666666666 | 0 |
| 0.7923611111111111 | 0 |
| 0.7930555555555556 | 0 |
| 0.7937500000000001 | 0 |
| 0.7944444444444444 | 0 |
| 0.7951388888888888 | 0 |
| 0.7958333333333334 | 0 |
| 0.7965277777777778 | 0 |
| 0.7972222222222222 | 0 |
| 0.7979166666666666 | 0 |
| 0.7986111111111112 | 0 |
| 0.7993055555555556 | 0 |
| 0.7999999999999999 | 0 |
| 0.8006944444444444 | 0 |
| 0.8013888888888889 | 0 |
| 0.8020833333333334 | 0 |
| 0.8027777777777777 | 0 |
| 0.8034722222222223 | 0 |
| 0.8041666666666667 | 0 |
| 0.8048611111111111 | 0 |
| 0.8055555555555555 | 0 |
| 0.80625 | 0 |
| 0.8069444444444445 | 0 |
| 0.8076388888888889 | 0 |
| 0.8083333333333332 | 0 |
| 0.8090277777777778 | 0 |
| 0.8097222222222222 | 0 |
| 0.8104166666666667 | 0 |
| 0.811111111111111 | 0 |
| 0.8118055555555556 | 0 |
| 0.8125 | 0 |
| 0.8131944444444444 | 0 |
| 0.813888888888889 | 0 |
| 0.8145833333333333 | 0 |
| 0.8152777777777778 | 0 |
| 0.8159722222222222 | 0 |
| 0.8166666666666668 | 0 |
| 0.8173611111111111 | 0 |
| 0.8180555555555555 | 0 |
| 0.81875 | 0 |
| 0.8194444444444445 | 0 |
| 0.8201388888888889 | 0 |
| 0.8208333333333333 | 0 |
| 0.8215277777777777 | 0 |
| 0.8222222222222223 | 0 |
| 0.8229166666666666 | 0 |
| 0.8236111111111111 | 0 |
| 0.8243055555555556 | 0 |
| 0.8250000000000001 | 0 |
| 0.8256944444444444 | 0 |
| 0.8263888888888888 | 0 |
| 0.8270833333333334 | 0 |
| 0.8277777777777778 | 0 |
| 0.8284722222222222 | 0 |
| 0.8291666666666666 | 0 |
| 0.8298611111111112 | 0 |
| 0.8305555555555556 | 0 |
| 0.8312499999999999 | 0 |
| 0.8319444444444444 | 0 |
| 0.8326388888888889 | 0 |
| 0.8333333333333334 | 0 |
| 0.8340277777777777 | 0 |
| 0.8347222222222223 | 0 |
| 0.8354166666666667 | 0 |
| 0.8361111111111111 | 0 |
| 0.8368055555555555 | 0 |
| 0.8375 | 0 |
| 0.8381944444444445 | 0 |
| 0.8388888888888889 | 0 |
| 0.8395833333333332 | 0 |
| 0.8402777777777778 | 0 |
| 0.8409722222222222 | 0 |
| 0.8416666666666667 | 0 |
| 0.842361111111111 | 0 |
| 0.8430555555555556 | 0 |
| 0.84375 | 0 |
| 0.8444444444444444 | 0 |
| 0.845138888888889 | 0 |
| 0.8458333333333333 | 0 |
| 0.8465277777777778 | 0 |
| 0.8472222222222222 | 0 |
| 0.8479166666666668 | 0 |
| 0.8486111111111111 | 0 |
| 0.8493055555555555 | 0 |
| 0.85 | 0 |
| 0.8506944444444445 | 0 |
| 0.8513888888888889 | 0 |
| 0.8520833333333333 | 0 |
| 0.8527777777777777 | 0 |
| 0.8534722222222223 | 0 |
| 0.8541666666666666 | 0 |
| 0.8548611111111111 | 0 |
| 0.8555555555555556 | 0 |
| 0.8562500000000001 | 0 |
| 0.8569444444444444 | 0 |
| 0.8576388888888888 | 0 |
| 0.8583333333333334 | 0 |
| 0.8590277777777778 | 0 |
| 0.8597222222222222 | 0 |
| 0.8604166666666666 | 0 |
| 0.8611111111111112 | 0 |
| 0.8618055555555556 | 0 |
| 0.8624999999999999 | 0 |
| 0.8631944444444444 | 0 |
| 0.8638888888888889 | 0 |
| 0.8645833333333334 | 0 |
| 0.8652777777777777 | 0 |
| 0.8659722222222223 | 0 |
| 0.8666666666666667 | 0 |
| 0.8673611111111111 | 0 |
| 0.8680555555555555 | 0 |
| 0.86875 | 0 |
| 0.8694444444444445 | 0 |
| 0.8701388888888889 | 0 |
| 0.8708333333333332 | 0 |
| 0.8715277777777778 | 0 |
| 0.8722222222222222 | 0 |
| 0.8729166666666667 | 0 |
| 0.873611111111111 | 0 |
| 0.8743055555555556 | 0 |
| 0.875 | 0 |
| 0.8756944444444444 | 0 |
| 0.876388888888889 | 0 |
| 0.8770833333333333 | 0 |
| 0.8777777777777778 | 0 |
| 0.8784722222222222 | 0 |
| 0.8791666666666668 | 0 |
| 0.8798611111111111 | 0 |
| 0.8805555555555555 | 0 |
| 0.88125 | 0 |
| 0.8819444444444445 | 0 |
| 0.8826388888888889 | 0 |
| 0.8833333333333333 | 0 |
| 0.8840277777777777 | 0 |
| 0.8847222222222223 | 0 |
| 0.8854166666666666 | 0 |
| 0.8861111111111111 | 0 |
| 0.8868055555555556 | 0 |
| 0.8875000000000001 | 0 |
| 0.8881944444444444 | 0 |
| 0.8888888888888888 | 0 |
| 0.8895833333333334 | 0 |
| 0.8902777777777778 | 0 |
| 0.8909722222222222 | 0 |
| 0.8916666666666666 | 0 |
| 0.8923611111111112 | 0 |
| 0.8930555555555556 | 0 |
| 0.8937499999999999 | 0 |
| 0.8944444444444444 | 0 |
| 0.8951388888888889 | 0 |
| 0.8958333333333334 | 0 |
| 0.8965277777777777 | 0 |
| 0.8972222222222223 | 0 |
| 0.8979166666666667 | 0 |
| 0.8986111111111111 | 0 |
| 0.8993055555555555 | 0 |
| 0.9 | 0 |
| 0.9006944444444445 | 0 |
| 0.9013888888888889 | 0 |
| 0.9020833333333332 | 0 |
| 0.9027777777777778 | 0 |
| 0.9034722222222222 | 0 |
| 0.9041666666666667 | 0 |
| 0.904861111111111 | 0 |
| 0.9055555555555556 | 0 |
| 0.90625 | 0 |
| 0.9069444444444444 | 0 |
| 0.907638888888889 | 0 |
| 0.9083333333333333 | 0 |
| 0.9090277777777778 | 0 |
| 0.9097222222222222 | 0 |
| 0.9104166666666668 | 0 |
| 0.9111111111111111 | 0 |
| 0.9118055555555555 | 0 |
| 0.9125 | 0 |
| 0.9131944444444445 | 0 |
| 0.9138888888888889 | 0 |
| 0.9145833333333333 | 0 |
| 0.9152777777777777 | 0 |
| 0.9159722222222223 | 0 |
| 0.9166666666666666 | 0 |
| 0.9173611111111111 | 0 |
| 0.9180555555555556 | 0 |
| 0.9187500000000001 | 0 |
| 0.9194444444444444 | 0 |
| 0.9201388888888888 | 0 |
| 0.9208333333333334 | 0 |
| 0.9215277777777778 | 0 |
| 0.9222222222222222 | 0 |
| 0.9229166666666666 | 0 |
| 0.9236111111111112 | 0 |
| 0.9243055555555556 | 0 |
| 0.9249999999999999 | 0 |
| 0.9256944444444444 | 0 |
| 0.9263888888888889 | 0 |
| 0.9270833333333334 | 0 |
| 0.9277777777777777 | 0 |
| 0.9284722222222223 | 0 |
| 0.9291666666666667 | 0 |
| 0.9298611111111111 | 0 |
| 0.9305555555555555 | 0 |
| 0.93125 | 0 |
| 0.9319444444444445 | 0 |
| 0.9326388888888889 | 0 |
| 0.9333333333333332 | 0 |
| 0.9340277777777778 | 0 |
| 0.9347222222222222 | 0 |
| 0.9354166666666667 | 0 |
| 0.936111111111111 | 0 |
| 0.9368055555555556 | 0 |
| 0.9375 | 0 |
| 0.9381944444444444 | 0 |
| 0.938888888888889 | 0 |
| 0.9395833333333333 | 0 |
| 0.9402777777777778 | 0 |
| 0.9409722222222222 | 0 |
| 0.9416666666666668 | 0 |
| 0.9423611111111111 | 0 |
| 0.9430555555555555 | 0 |
| 0.94375 | 0 |
| 0.9444444444444445 | 0 |
| 0.9451388888888889 | 0 |
| 0.9458333333333333 | 0 |
| 0.9465277777777777 | 0 |
| 0.9472222222222223 | 0 |
| 0.9479166666666666 | 0 |
| 0.9486111111111111 | 0 |
| 0.9493055555555556 | 0 |
| 0.9500000000000001 | 0 |
| 0.9506944444444444 | 0 |
| 0.9513888888888888 | 0 |
| 0.9520833333333334 | 0 |
| 0.9527777777777778 | 0 |
| 0.9534722222222222 | 0 |
| 0.9541666666666666 | 0 |
| 0.9548611111111112 | 0 |
| 0.9555555555555556 | 0 |
| 0.9562499999999999 | 0 |
| 0.9569444444444444 | 0 |
| 0.9576388888888889 | 0 |
| 0.9583333333333334 | 0 |
| 0.9590277777777777 | 0 |
| 0.9597222222222223 | 0 |
| 0.9604166666666667 | 0 |
| 0.9611111111111111 | 0 |
| 0.9618055555555555 | 0 |
| 0.9625 | 0 |
| 0.9631944444444445 | 0 |
| 0.9638888888888889 | 0 |
| 0.9645833333333332 | 0 |
| 0.9652777777777778 | 0 |
| 0.9659722222222222 | 0 |
| 0.9666666666666667 | 0 |
| 0.967361111111111 | 0 |
| 0.9680555555555556 | 0 |
| 0.96875 | 0 |
| 0.9694444444444444 | 0 |
| 0.970138888888889 | 0 |
| 0.9708333333333333 | 0 |
| 0.9715277777777778 | 0 |
| 0.9722222222222222 | 0 |
| 0.9729166666666668 | 0 |
| 0.9736111111111111 | 0 |
| 0.9743055555555555 | 0 |
| 0.975 | 0 |
| 0.9756944444444445 | 0 |
| 0.9763888888888889 | 0 |
| 0.9770833333333333 | 0 |
| 0.9777777777777777 | 0 |
| 0.9784722222222223 | 0 |
| 0.9791666666666666 | 0 |
| 0.9798611111111111 | 0 |
| 0.9805555555555556 | 0 |
| 0.9812500000000001 | 0 |
| 0.9819444444444444 | 0 |
| 0.9826388888888888 | 0 |
| 0.9833333333333334 | 0 |
| 0.9840277777777778 | 0 |
| 0.9847222222222222 | 0 |
| 0.9854166666666666 | 0 |
| 0.9861111111111112 | 0 |
| 0.9868055555555556 | 0 |
| 0.9874999999999999 | 0 |
| 0.9881944444444444 | 0 |
| 0.9888888888888889 | 0 |
| 0.9895833333333334 | 0 |
| 0.9902777777777777 | 0 |
| 0.9909722222222223 | 0 |
| 0.9916666666666667 | 0 |
| 0.9923611111111111 | 0 |
| 0.9930555555555555 | 0 |
| 0.99375 | 0 |
| 0.9944444444444445 | 0 |
| 0.9951388888888889 | 0 |
| 0.9958333333333332 | 0 |
| 0.9965277777777778 | 0 |
| 0.9972222222222222 | 0 |
| 0.9979166666666667 | 0 |
| 0.998611111111111 | 0 |
| 0.9993055555555556 | 0 |